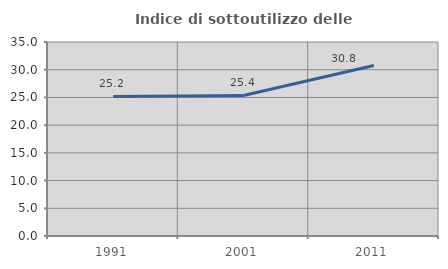
| Category | Indice di sottoutilizzo delle abitazioni  |
|---|---|
| 1991.0 | 25.177 |
| 2001.0 | 25.35 |
| 2011.0 | 30.769 |